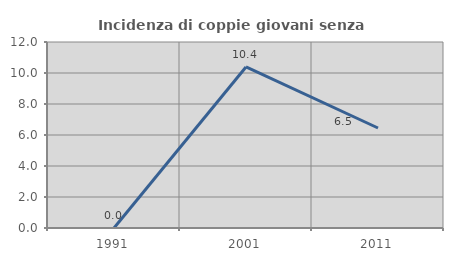
| Category | Incidenza di coppie giovani senza figli |
|---|---|
| 1991.0 | 0 |
| 2001.0 | 10.39 |
| 2011.0 | 6.452 |